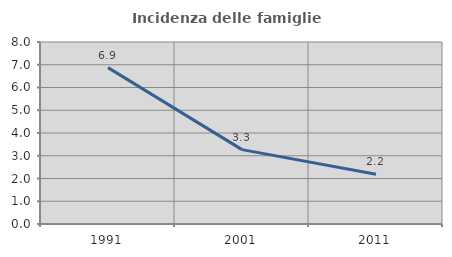
| Category | Incidenza delle famiglie numerose |
|---|---|
| 1991.0 | 6.874 |
| 2001.0 | 3.269 |
| 2011.0 | 2.184 |